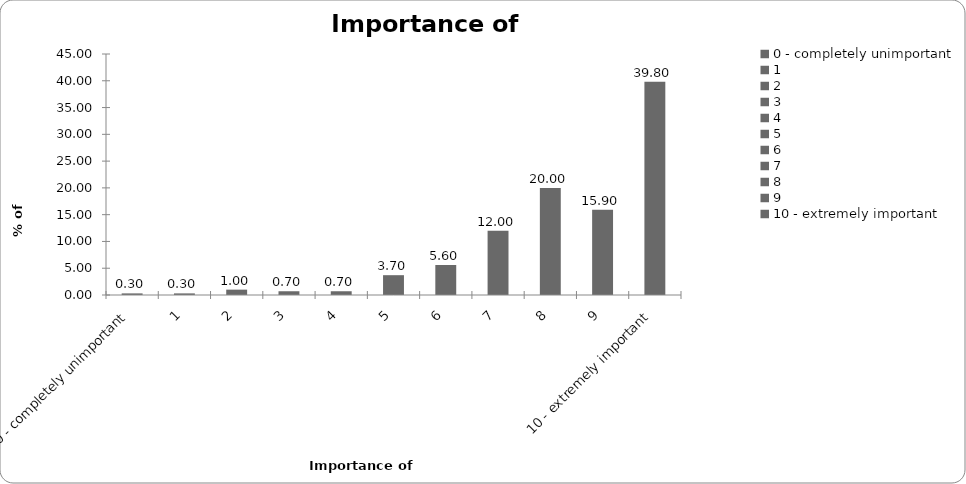
| Category | Importance of insurance |
|---|---|
| 0 - completely unimportant | 0.3 |
| 1 | 0.3 |
| 2 | 1 |
| 3 | 0.7 |
| 4 | 0.7 |
| 5 | 3.7 |
| 6 | 5.6 |
| 7 | 12 |
| 8 | 20 |
| 9 | 15.9 |
| 10 - extremely important | 39.8 |